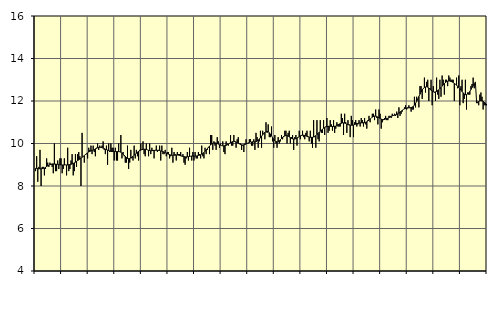
| Category | Utbildning, SNI 85 | Series 3 |
|---|---|---|
| nan | 8.7 | 8.83 |
| 87.0 | 9.4 | 8.83 |
| 87.0 | 8.2 | 8.82 |
| 87.0 | 8.9 | 8.81 |
| 87.0 | 9.7 | 8.81 |
| 87.0 | 8 | 8.81 |
| 87.0 | 8.9 | 8.82 |
| 87.0 | 8.9 | 8.83 |
| 87.0 | 8.5 | 8.85 |
| 87.0 | 8.8 | 8.88 |
| 87.0 | 9.3 | 8.92 |
| 87.0 | 9.1 | 8.95 |
| nan | 8.9 | 8.98 |
| 88.0 | 9.1 | 9.01 |
| 88.0 | 9 | 9.02 |
| 88.0 | 8.9 | 9.04 |
| 88.0 | 8.6 | 9.04 |
| 88.0 | 10 | 9.03 |
| 88.0 | 8.7 | 9.03 |
| 88.0 | 8.7 | 9.02 |
| 88.0 | 9.2 | 9.02 |
| 88.0 | 8.8 | 9.01 |
| 88.0 | 9.3 | 9 |
| 88.0 | 9.3 | 9 |
| nan | 8.6 | 8.99 |
| 89.0 | 8.8 | 8.99 |
| 89.0 | 9.3 | 8.99 |
| 89.0 | 9 | 8.99 |
| 89.0 | 8.5 | 8.99 |
| 89.0 | 9.8 | 8.99 |
| 89.0 | 8.7 | 9 |
| 89.0 | 8.8 | 9.01 |
| 89.0 | 9.2 | 9.02 |
| 89.0 | 9.5 | 9.04 |
| 89.0 | 8.5 | 9.06 |
| 89.0 | 8.7 | 9.09 |
| nan | 9.5 | 9.12 |
| 90.0 | 8.9 | 9.16 |
| 90.0 | 9.5 | 9.2 |
| 90.0 | 9.6 | 9.23 |
| 90.0 | 9.4 | 9.27 |
| 90.0 | 8 | 9.31 |
| 90.0 | 10.5 | 9.35 |
| 90.0 | 9.4 | 9.39 |
| 90.0 | 9.1 | 9.43 |
| 90.0 | 9.5 | 9.48 |
| 90.0 | 9.5 | 9.52 |
| 90.0 | 9.3 | 9.56 |
| nan | 9.8 | 9.6 |
| 91.0 | 9.7 | 9.63 |
| 91.0 | 9.9 | 9.65 |
| 91.0 | 9.5 | 9.67 |
| 91.0 | 9.9 | 9.69 |
| 91.0 | 9.6 | 9.71 |
| 91.0 | 9.4 | 9.75 |
| 91.0 | 9.8 | 9.77 |
| 91.0 | 10 | 9.8 |
| 91.0 | 9.7 | 9.82 |
| 91.0 | 9.9 | 9.82 |
| 91.0 | 9.8 | 9.82 |
| nan | 9.9 | 9.81 |
| 92.0 | 10.1 | 9.78 |
| 92.0 | 9.7 | 9.76 |
| 92.0 | 9.5 | 9.73 |
| 92.0 | 9.9 | 9.71 |
| 92.0 | 9 | 9.69 |
| 92.0 | 10 | 9.67 |
| 92.0 | 9.6 | 9.65 |
| 92.0 | 10 | 9.63 |
| 92.0 | 9.8 | 9.62 |
| 92.0 | 9.8 | 9.62 |
| 92.0 | 9.2 | 9.62 |
| nan | 9.8 | 9.62 |
| 93.0 | 9.2 | 9.62 |
| 93.0 | 9.2 | 9.62 |
| 93.0 | 10 | 9.62 |
| 93.0 | 9.6 | 9.61 |
| 93.0 | 10.4 | 9.59 |
| 93.0 | 9.3 | 9.55 |
| 93.0 | 9.6 | 9.5 |
| 93.0 | 9.4 | 9.45 |
| 93.0 | 9.1 | 9.39 |
| 93.0 | 9.1 | 9.34 |
| 93.0 | 9.9 | 9.3 |
| nan | 8.8 | 9.29 |
| 94.0 | 9.1 | 9.3 |
| 94.0 | 9.7 | 9.32 |
| 94.0 | 9.3 | 9.36 |
| 94.0 | 9.2 | 9.4 |
| 94.0 | 9.9 | 9.45 |
| 94.0 | 9.3 | 9.5 |
| 94.0 | 9.7 | 9.54 |
| 94.0 | 9.4 | 9.59 |
| 94.0 | 9.2 | 9.63 |
| 94.0 | 9.7 | 9.66 |
| 94.0 | 10 | 9.69 |
| nan | 9.7 | 9.71 |
| 95.0 | 10.1 | 9.73 |
| 95.0 | 9.5 | 9.73 |
| 95.0 | 9.4 | 9.73 |
| 95.0 | 10 | 9.72 |
| 95.0 | 9.7 | 9.7 |
| 95.0 | 9.4 | 9.68 |
| 95.0 | 10 | 9.67 |
| 95.0 | 9.5 | 9.66 |
| 95.0 | 9.8 | 9.66 |
| 95.0 | 9.7 | 9.67 |
| 95.0 | 9.3 | 9.67 |
| nan | 9.7 | 9.68 |
| 96.0 | 9.9 | 9.68 |
| 96.0 | 9.6 | 9.68 |
| 96.0 | 9.7 | 9.67 |
| 96.0 | 9.9 | 9.67 |
| 96.0 | 9.2 | 9.65 |
| 96.0 | 9.9 | 9.64 |
| 96.0 | 9.5 | 9.62 |
| 96.0 | 9.5 | 9.59 |
| 96.0 | 9.7 | 9.57 |
| 96.0 | 9.4 | 9.55 |
| 96.0 | 9.6 | 9.52 |
| nan | 9.6 | 9.5 |
| 97.0 | 9.3 | 9.48 |
| 97.0 | 9.4 | 9.46 |
| 97.0 | 9.8 | 9.45 |
| 97.0 | 9.1 | 9.44 |
| 97.0 | 9.6 | 9.45 |
| 97.0 | 9.5 | 9.45 |
| 97.0 | 9.2 | 9.46 |
| 97.0 | 9.6 | 9.46 |
| 97.0 | 9.5 | 9.45 |
| 97.0 | 9.5 | 9.44 |
| 97.0 | 9.6 | 9.42 |
| nan | 9.4 | 9.41 |
| 98.0 | 9.5 | 9.39 |
| 98.0 | 9.1 | 9.38 |
| 98.0 | 9 | 9.37 |
| 98.0 | 9.3 | 9.37 |
| 98.0 | 9.6 | 9.38 |
| 98.0 | 9.2 | 9.38 |
| 98.0 | 9.8 | 9.39 |
| 98.0 | 9.4 | 9.4 |
| 98.0 | 9.2 | 9.41 |
| 98.0 | 9.6 | 9.41 |
| 98.0 | 9.2 | 9.41 |
| nan | 9.6 | 9.41 |
| 99.0 | 9.3 | 9.41 |
| 99.0 | 9.3 | 9.42 |
| 99.0 | 9.6 | 9.44 |
| 99.0 | 9.5 | 9.45 |
| 99.0 | 9.3 | 9.47 |
| 99.0 | 9.9 | 9.5 |
| 99.0 | 9.4 | 9.53 |
| 99.0 | 9.3 | 9.58 |
| 99.0 | 9.8 | 9.63 |
| 99.0 | 9.5 | 9.69 |
| 99.0 | 9.7 | 9.75 |
| nan | 9.8 | 9.82 |
| 0.0 | 9.5 | 9.88 |
| 0.0 | 10.4 | 9.93 |
| 0.0 | 10.4 | 9.98 |
| 0.0 | 9.7 | 10.01 |
| 0.0 | 10.1 | 10.03 |
| 0.0 | 9.9 | 10.03 |
| 0.0 | 9.7 | 10.02 |
| 0.0 | 10.3 | 10 |
| 0.0 | 10.1 | 9.97 |
| 0.0 | 9.8 | 9.94 |
| 0.0 | 10 | 9.92 |
| nan | 9.9 | 9.9 |
| 1.0 | 10.1 | 9.89 |
| 1.0 | 9.6 | 9.89 |
| 1.0 | 9.5 | 9.9 |
| 1.0 | 10.1 | 9.91 |
| 1.0 | 10 | 9.94 |
| 1.0 | 9.9 | 9.97 |
| 1.0 | 10 | 10.01 |
| 1.0 | 10.4 | 10.04 |
| 1.0 | 9.9 | 10.07 |
| 1.0 | 9.9 | 10.09 |
| 1.0 | 10.4 | 10.1 |
| nan | 10.1 | 10.09 |
| 2.0 | 9.8 | 10.07 |
| 2.0 | 10.2 | 10.04 |
| 2.0 | 10.3 | 10.01 |
| 2.0 | 10 | 9.98 |
| 2.0 | 10 | 9.95 |
| 2.0 | 9.7 | 9.94 |
| 2.0 | 9.9 | 9.93 |
| 2.0 | 9.6 | 9.94 |
| 2.0 | 10 | 9.95 |
| 2.0 | 10.2 | 9.98 |
| 2.0 | 10 | 10 |
| nan | 10 | 10.03 |
| 3.0 | 10.2 | 10.05 |
| 3.0 | 10.2 | 10.07 |
| 3.0 | 9.9 | 10.07 |
| 3.0 | 9.9 | 10.08 |
| 3.0 | 10.2 | 10.08 |
| 3.0 | 9.7 | 10.08 |
| 3.0 | 10.5 | 10.09 |
| 3.0 | 10.3 | 10.12 |
| 3.0 | 9.8 | 10.16 |
| 3.0 | 10.1 | 10.21 |
| 3.0 | 10.6 | 10.27 |
| nan | 9.8 | 10.34 |
| 4.0 | 10.6 | 10.41 |
| 4.0 | 10.5 | 10.47 |
| 4.0 | 10.2 | 10.53 |
| 4.0 | 11 | 10.56 |
| 4.0 | 10.5 | 10.57 |
| 4.0 | 10.9 | 10.55 |
| 4.0 | 10.3 | 10.51 |
| 4.0 | 10.3 | 10.44 |
| 4.0 | 10.8 | 10.36 |
| 4.0 | 10.1 | 10.27 |
| 4.0 | 9.8 | 10.19 |
| nan | 10.4 | 10.13 |
| 5.0 | 10 | 10.09 |
| 5.0 | 9.8 | 10.08 |
| 5.0 | 10.3 | 10.09 |
| 5.0 | 10 | 10.13 |
| 5.0 | 10.1 | 10.18 |
| 5.0 | 10.4 | 10.24 |
| 5.0 | 10.2 | 10.29 |
| 5.0 | 10.3 | 10.33 |
| 5.0 | 10.6 | 10.36 |
| 5.0 | 10.6 | 10.37 |
| 5.0 | 10 | 10.37 |
| nan | 10.5 | 10.35 |
| 6.0 | 10.6 | 10.31 |
| 6.0 | 10 | 10.28 |
| 6.0 | 10.3 | 10.24 |
| 6.0 | 10.4 | 10.22 |
| 6.0 | 9.7 | 10.21 |
| 6.0 | 10.3 | 10.21 |
| 6.0 | 10.4 | 10.23 |
| 6.0 | 9.9 | 10.26 |
| 6.0 | 10.3 | 10.29 |
| 6.0 | 10.6 | 10.33 |
| 6.0 | 10.2 | 10.36 |
| nan | 10.4 | 10.38 |
| 7.0 | 10.6 | 10.39 |
| 7.0 | 10.3 | 10.39 |
| 7.0 | 10.2 | 10.38 |
| 7.0 | 10.5 | 10.36 |
| 7.0 | 10.6 | 10.34 |
| 7.0 | 10.3 | 10.32 |
| 7.0 | 10.1 | 10.3 |
| 7.0 | 10.6 | 10.29 |
| 7.0 | 10 | 10.29 |
| 7.0 | 9.8 | 10.29 |
| 7.0 | 11.1 | 10.31 |
| nan | 10.3 | 10.34 |
| 8.0 | 9.8 | 10.37 |
| 8.0 | 11.1 | 10.42 |
| 8.0 | 10.2 | 10.47 |
| 8.0 | 10.1 | 10.53 |
| 8.0 | 11.1 | 10.58 |
| 8.0 | 10.5 | 10.63 |
| 8.0 | 10.5 | 10.67 |
| 8.0 | 11.1 | 10.72 |
| 8.0 | 10.4 | 10.75 |
| 8.0 | 10.8 | 10.78 |
| 8.0 | 11.2 | 10.8 |
| nan | 10.5 | 10.81 |
| 9.0 | 10.6 | 10.81 |
| 9.0 | 11.1 | 10.81 |
| 9.0 | 10.9 | 10.8 |
| 9.0 | 10.6 | 10.8 |
| 9.0 | 11.1 | 10.8 |
| 9.0 | 10.5 | 10.81 |
| 9.0 | 10.7 | 10.82 |
| 9.0 | 11 | 10.85 |
| 9.0 | 10.8 | 10.88 |
| 9.0 | 10.8 | 10.91 |
| 9.0 | 10.8 | 10.93 |
| nan | 11.4 | 10.95 |
| 10.0 | 11.2 | 10.97 |
| 10.0 | 10.4 | 10.97 |
| 10.0 | 11.4 | 10.96 |
| 10.0 | 11 | 10.94 |
| 10.0 | 10.5 | 10.91 |
| 10.0 | 11.1 | 10.89 |
| 10.0 | 10.9 | 10.87 |
| 10.0 | 10.3 | 10.86 |
| 10.0 | 11.3 | 10.86 |
| 10.0 | 11.1 | 10.86 |
| 10.0 | 10.3 | 10.87 |
| nan | 11 | 10.89 |
| 11.0 | 11.1 | 10.91 |
| 11.0 | 10.8 | 10.94 |
| 11.0 | 10.9 | 10.95 |
| 11.0 | 11.1 | 10.96 |
| 11.0 | 10.8 | 10.97 |
| 11.0 | 11.2 | 10.97 |
| 11.0 | 11.1 | 10.97 |
| 11.0 | 10.8 | 10.98 |
| 11.0 | 11.2 | 10.98 |
| 11.0 | 10.9 | 11 |
| 11.0 | 10.7 | 11.02 |
| nan | 11.1 | 11.06 |
| 12.0 | 11.3 | 11.1 |
| 12.0 | 11 | 11.15 |
| 12.0 | 11.2 | 11.2 |
| 12.0 | 11.4 | 11.24 |
| 12.0 | 11.4 | 11.27 |
| 12.0 | 11.1 | 11.29 |
| 12.0 | 11.6 | 11.29 |
| 12.0 | 11.2 | 11.27 |
| 12.0 | 10.9 | 11.24 |
| 12.0 | 11.6 | 11.21 |
| 12.0 | 11.4 | 11.18 |
| nan | 10.7 | 11.15 |
| 13.0 | 11 | 11.13 |
| 13.0 | 11.1 | 11.13 |
| 13.0 | 11.2 | 11.13 |
| 13.0 | 11.3 | 11.15 |
| 13.0 | 11.1 | 11.17 |
| 13.0 | 11.1 | 11.19 |
| 13.0 | 11.3 | 11.22 |
| 13.0 | 11.3 | 11.25 |
| 13.0 | 11.2 | 11.28 |
| 13.0 | 11.4 | 11.3 |
| 13.0 | 11.3 | 11.32 |
| nan | 11.4 | 11.33 |
| 14.0 | 11.3 | 11.35 |
| 14.0 | 11.5 | 11.37 |
| 14.0 | 11.2 | 11.4 |
| 14.0 | 11.7 | 11.43 |
| 14.0 | 11.3 | 11.47 |
| 14.0 | 11.4 | 11.52 |
| 14.0 | 11.5 | 11.56 |
| 14.0 | 11.6 | 11.6 |
| 14.0 | 11.7 | 11.63 |
| 14.0 | 11.8 | 11.65 |
| 14.0 | 11.6 | 11.67 |
| nan | 11.7 | 11.67 |
| 15.0 | 11.8 | 11.68 |
| 15.0 | 11.7 | 11.68 |
| 15.0 | 11.5 | 11.69 |
| 15.0 | 11.6 | 11.71 |
| 15.0 | 11.6 | 11.75 |
| 15.0 | 12.2 | 11.81 |
| 15.0 | 11.7 | 11.89 |
| 15.0 | 12.2 | 11.98 |
| 15.0 | 12.1 | 12.09 |
| 15.0 | 11.7 | 12.21 |
| 15.0 | 12.7 | 12.32 |
| nan | 12.7 | 12.43 |
| 16.0 | 12.1 | 12.52 |
| 16.0 | 12.6 | 12.59 |
| 16.0 | 13.1 | 12.64 |
| 16.0 | 12.4 | 12.66 |
| 16.0 | 12.9 | 12.67 |
| 16.0 | 13 | 12.65 |
| 16.0 | 12 | 12.61 |
| 16.0 | 12.6 | 12.56 |
| 16.0 | 13 | 12.51 |
| 16.0 | 11.8 | 12.47 |
| 16.0 | 12.7 | 12.44 |
| nan | 12.4 | 12.42 |
| 17.0 | 12 | 12.43 |
| 17.0 | 13.1 | 12.45 |
| 17.0 | 12.3 | 12.49 |
| 17.0 | 12.1 | 12.53 |
| 17.0 | 13 | 12.58 |
| 17.0 | 12.2 | 12.64 |
| 17.0 | 13.2 | 12.7 |
| 17.0 | 13 | 12.76 |
| 17.0 | 12.3 | 12.82 |
| 17.0 | 13 | 12.87 |
| 17.0 | 13 | 12.91 |
| nan | 12.7 | 12.93 |
| 18.0 | 13.2 | 12.94 |
| 18.0 | 13.1 | 12.94 |
| 18.0 | 13 | 12.92 |
| 18.0 | 13 | 12.9 |
| 18.0 | 13 | 12.87 |
| 18.0 | 12 | 12.83 |
| 18.0 | 12.8 | 12.79 |
| 18.0 | 13.1 | 12.75 |
| 18.0 | 12.6 | 12.69 |
| 18.0 | 13.2 | 12.64 |
| 18.0 | 11.8 | 12.58 |
| nan | 12.7 | 12.51 |
| 19.0 | 13 | 12.44 |
| 19.0 | 11.9 | 12.38 |
| 19.0 | 12.1 | 12.33 |
| 19.0 | 13 | 12.3 |
| 19.0 | 11.6 | 12.3 |
| 19.0 | 12.4 | 12.33 |
| 19.0 | 12.3 | 12.38 |
| 19.0 | 12.3 | 12.45 |
| 19.0 | 12.7 | 12.54 |
| 19.0 | 12.8 | 12.63 |
| 19.0 | 13.1 | 12.72 |
| nan | 12.6 | 12.81 |
| 20.0 | 12.9 | 12.89 |
| 20.0 | 11.9 | 12.05 |
| 20.0 | 11.9 | 11.91 |
| 20.0 | 11.8 | 11.98 |
| 20.0 | 12.3 | 12.01 |
| 20.0 | 12.4 | 12.02 |
| 20.0 | 12.2 | 12 |
| 20.0 | 11.6 | 11.98 |
| 20.0 | 11.8 | 11.94 |
| 20.0 | 11.8 | 11.9 |
| 20.0 | 11.8 | 11.86 |